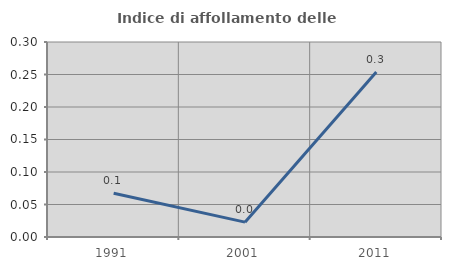
| Category | Indice di affollamento delle abitazioni  |
|---|---|
| 1991.0 | 0.067 |
| 2001.0 | 0.023 |
| 2011.0 | 0.254 |